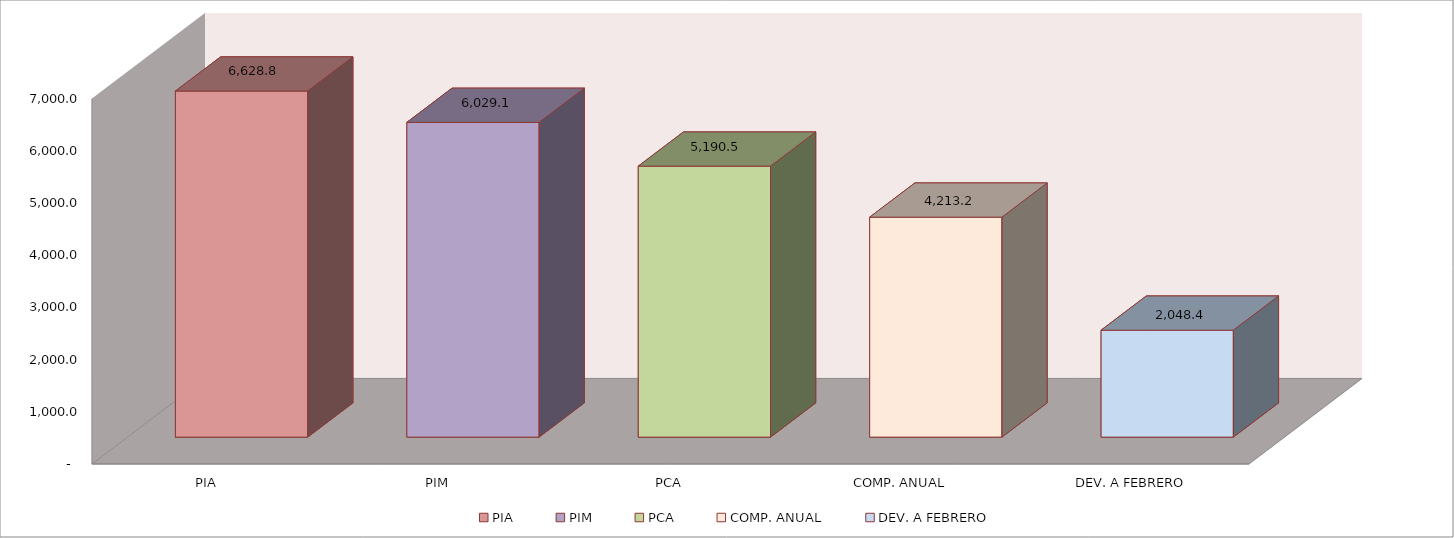
| Category | 011 MINISTERIO DE SALUD |
|---|---|
| PIA | 6628.781 |
| PIM | 6029.129 |
| PCA | 5190.531 |
| COMP. ANUAL | 4213.247 |
| DEV. A FEBRERO | 2048.364 |